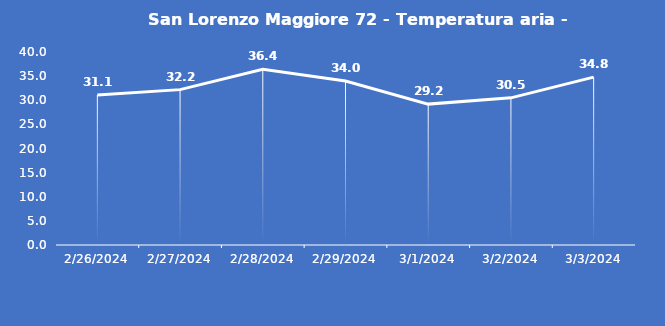
| Category | San Lorenzo Maggiore 72 - Temperatura aria - Grezzo (°C) |
|---|---|
| 2/26/24 | 31.1 |
| 2/27/24 | 32.2 |
| 2/28/24 | 36.4 |
| 2/29/24 | 34 |
| 3/1/24 | 29.2 |
| 3/2/24 | 30.5 |
| 3/3/24 | 34.8 |